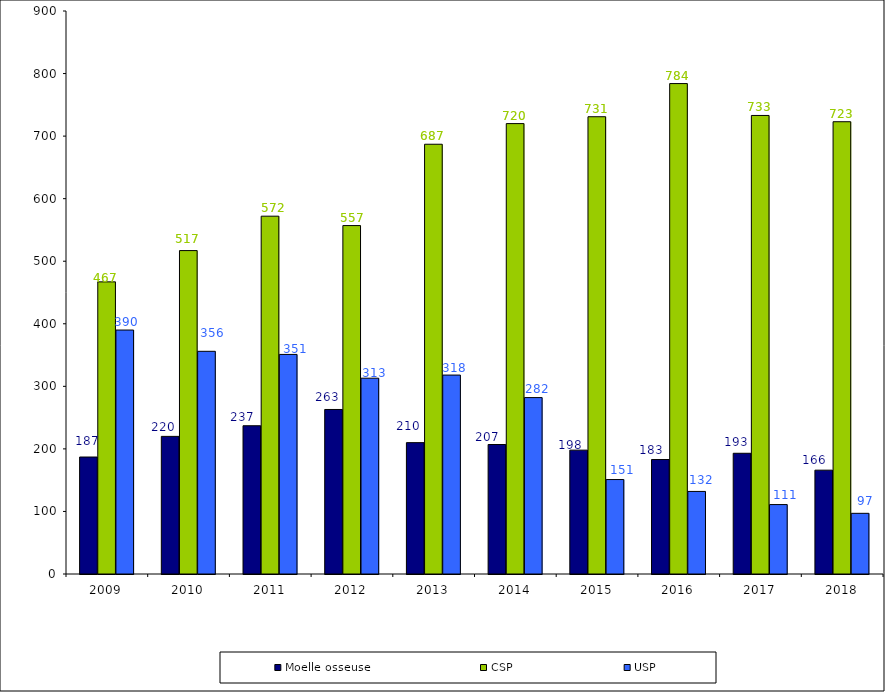
| Category | Moelle osseuse | CSP | USP |
|---|---|---|---|
| 2009.0 | 187 | 467 | 390 |
| 2010.0 | 220 | 517 | 356 |
| 2011.0 | 237 | 572 | 351 |
| 2012.0 | 263 | 557 | 313 |
| 2013.0 | 210 | 687 | 318 |
| 2014.0 | 207 | 720 | 282 |
| 2015.0 | 198 | 731 | 151 |
| 2016.0 | 183 | 784 | 132 |
| 2017.0 | 193 | 733 | 111 |
| 2018.0 | 166 | 723 | 97 |